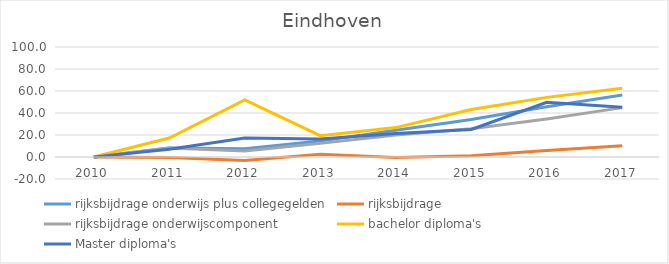
| Category | rijksbijdrage onderwijs plus collegegelden | rijksbijdrage  | rijksbijdrage onderwijscomponent | bachelor diploma's | Master diploma's |
|---|---|---|---|---|---|
| 2010.0 | 0 | 0 | 0 | 0 | 0 |
| 2011.0 | 8.124 | -0.536 | 8.161 | 17.252 | 7.103 |
| 2012.0 | 7.59 | -3.112 | 5.406 | 51.908 | 17.314 |
| 2013.0 | 14.626 | 2.414 | 12.391 | 19.389 | 16.315 |
| 2014.0 | 24.303 | -0.376 | 20.035 | 26.718 | 21.421 |
| 2015.0 | 34.12 | 1.18 | 25.761 | 43.206 | 24.972 |
| 2016.0 | 45.732 | 5.901 | 34.587 | 54.198 | 49.723 |
| 2017.0 | 56.419 | 10.193 | 44.88 | 62.595 | 45.283 |